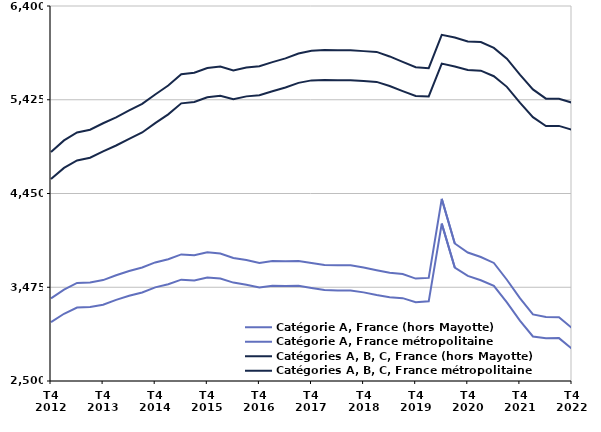
| Category | Catégorie A, France (hors Mayotte) | Catégorie A, France métropolitaine | Catégories A, B, C, France (hors Mayotte) | Catégories A, B, C, France métropolitaine |
|---|---|---|---|---|
| T4
2012 | 3360.1 | 3112.1 | 4881.7 | 4599.7 |
| T1
2013 | 3450.5 | 3199.3 | 5002.3 | 4716.5 |
| T2
2013 | 3519.4 | 3263.5 | 5084.8 | 4794 |
| T3
2013 | 3525.6 | 3269.5 | 5113.2 | 4822.1 |
| T4
2013 | 3549.6 | 3292.6 | 5180.4 | 4887.5 |
| T1
2014 | 3600.3 | 3343.8 | 5242.6 | 4949.4 |
| T2
2014 | 3643.8 | 3385.7 | 5314 | 5018.7 |
| T3
2014 | 3680.3 | 3421.1 | 5381.5 | 5084.6 |
| T4
2014 | 3733 | 3473.8 | 5479.6 | 5181.7 |
| T1
2015 | 3766.4 | 3506.3 | 5572.6 | 5273.1 |
| T2
2015 | 3816.5 | 3554.1 | 5691.3 | 5387.7 |
| T3
2015 | 3807 | 3545.1 | 5706.6 | 5402.5 |
| T4
2015 | 3837.8 | 3577.3 | 5754.8 | 5451.4 |
| T1
2016 | 3825.5 | 3565.5 | 5769.9 | 5466.5 |
| T2
2016 | 3779.2 | 3523.4 | 5730 | 5430.8 |
| T3
2016 | 3757.5 | 3501.9 | 5760 | 5460.1 |
| T4
2016 | 3727.7 | 3471.4 | 5773.5 | 5472.1 |
| T1
2017 | 3747.7 | 3490.5 | 5816.2 | 5513.8 |
| T2
2017 | 3744.5 | 3488.6 | 5855.6 | 5553.2 |
| T3
2017 | 3746.7 | 3489.7 | 5905.6 | 5600.8 |
| T4
2017 | 3727.1 | 3467.9 | 5934.8 | 5626.4 |
| T1
2018 | 3706.9 | 3446.5 | 5941.8 | 5631.4 |
| T2
2018 | 3703 | 3442.2 | 5939.3 | 5626.8 |
| T3
2018 | 3702.6 | 3442.3 | 5939.2 | 5626.8 |
| T4
2018 | 3680.6 | 3421.6 | 5930.7 | 5619 |
| T1
2019 | 3651.8 | 3393.7 | 5922.7 | 5610.7 |
| T2
2019 | 3625.1 | 3370.5 | 5875.5 | 5567.6 |
| T3
2019 | 3612.9 | 3361.8 | 5818.5 | 5514.6 |
| T4
2019 | 3564.9 | 3319 | 5763.1 | 5464.7 |
| T1
2020 | 3572.1 | 3328.5 | 5753.9 | 5459 |
| T2
2020 | 4394.2 | 4136.7 | 6100.6 | 5800.5 |
| T3
2020 | 3930.3 | 3680.5 | 6071.8 | 5770.7 |
| T4
2020 | 3836.3 | 3593.3 | 6030.4 | 5733.6 |
| T1
2021 | 3789.3 | 3548 | 6024.7 | 5727.8 |
| T2
2021 | 3727.7 | 3488.9 | 5964.2 | 5669.7 |
| T3
2021 | 3553 | 3317.3 | 5851.5 | 5559.2 |
| T4
2021 | 3361.9 | 3127.5 | 5685.4 | 5394.2 |
| T1
2022 | 3192.8 | 2962.8 | 5532.7 | 5244.2 |
| T2
2022 | 3165.9 | 2944.7 | 5436.1 | 5152.1 |
| T3
2022 | 3164.2 | 2946.1 | 5435.1 | 5153 |
| T4
2022 | 3049.8 | 2834 | 5394.2 | 5113.4 |